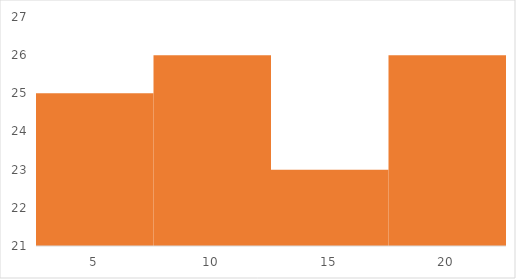
| Category | Frequency |
|---|---|
| 5.0 | 25 |
| 10.0 | 26 |
| 15.0 | 23 |
| 20.0 | 26 |